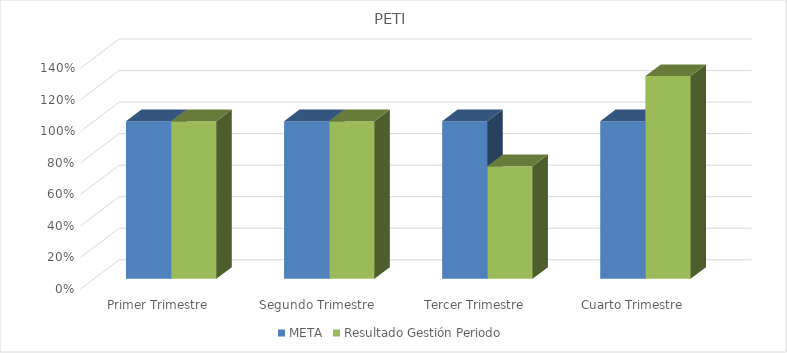
| Category | META | Resultado Gestión Periodo |
|---|---|---|
| Primer Trimestre | 1 | 1 |
| Segundo Trimestre | 1 | 1 |
| Tercer Trimestre | 1 | 0.714 |
| Cuarto Trimestre | 1 | 1.286 |